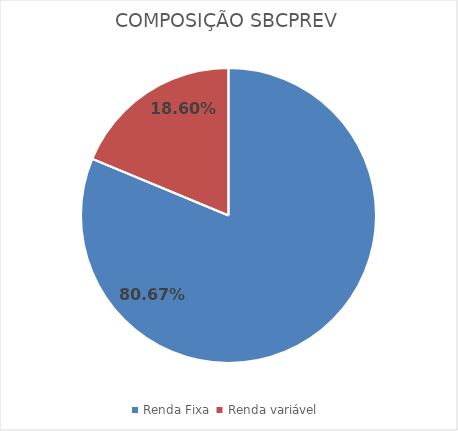
| Category | Series 0 |
|---|---|
| Renda Fixa  | 0.807 |
| Renda variável  | 0.186 |